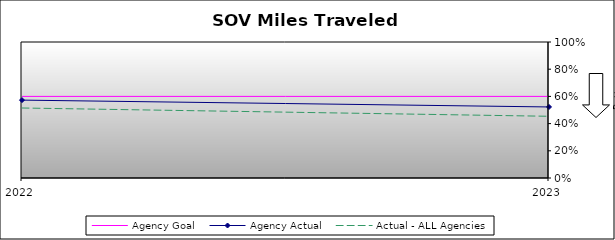
| Category | Agency Goal | Agency Actual | Actual - ALL Agencies |
|---|---|---|---|
| 2022.0 | 0.6 | 0.573 | 0.515 |
| 2023.0 | 0.6 | 0.522 | 0.454 |